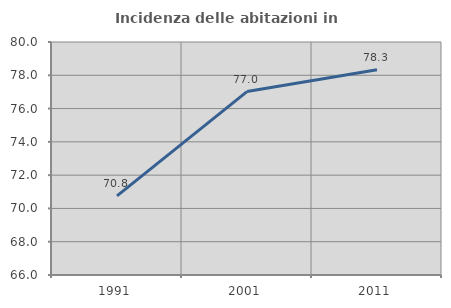
| Category | Incidenza delle abitazioni in proprietà  |
|---|---|
| 1991.0 | 70.753 |
| 2001.0 | 77.023 |
| 2011.0 | 78.336 |